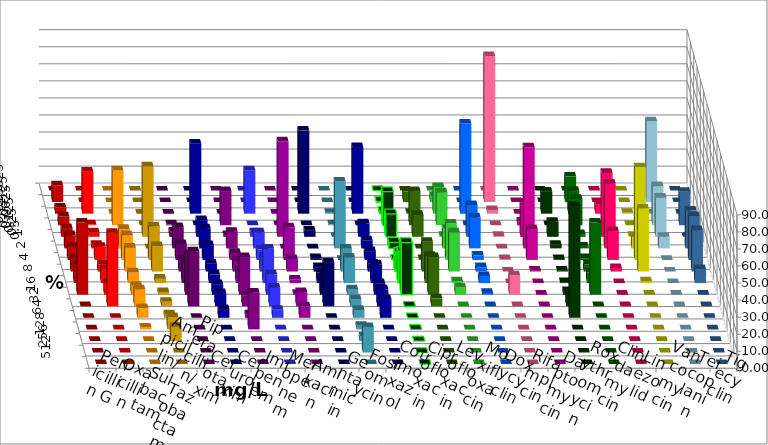
| Category | Penicillin G | Oxacillin | Ampicillin/ Sulbactam | Piperacillin/ Tazobactam | Cefotaxim | Cefuroxim | Imipenem | Meropenem | Amikacin | Gentamicin | Fosfomycin | Cotrimoxazol | Ciprofloxacin | Levofloxacin | Moxifloxacin | Doxycyclin | Rifampicin | Daptomycin | Roxythromycin | Clindamycin | Linezolid | Vancomycin | Teicoplanin | Tigecyclin |
|---|---|---|---|---|---|---|---|---|---|---|---|---|---|---|---|---|---|---|---|---|---|---|---|---|
| 0.015625 | 0 | 0 | 0 | 0 | 0 | 0 | 0 | 0 | 0 | 0 | 0 | 0 | 0 | 0 | 0 | 0 | 0 | 0 | 0 | 0 | 0 | 0 | 0 | 0 |
| 0.03125 | 9.794 | 0 | 0 | 0 | 0 | 0 | 0 | 0 | 0 | 0 | 0 | 0 | 0.518 | 6.154 | 3.646 | 0 | 85.641 | 0 | 0 | 14.948 | 0 | 0 | 0 | 47.396 |
| 0.0625 | 3.608 | 24.615 | 0 | 0 | 0 | 0 | 41.026 | 25.389 | 0 | 48.705 | 0.515 | 39.062 | 1.554 | 0.513 | 15.625 | 52.85 | 2.051 | 0 | 12.887 | 13.402 | 5.641 | 0.513 | 0 | 0 |
| 0.125 | 5.155 | 0.513 | 32.124 | 0 | 0.518 | 20 | 0 | 0 | 0 | 0 | 0.515 | 0 | 19.689 | 20 | 19.271 | 0 | 0 | 2.062 | 0 | 15.464 | 0 | 0 | 19.588 | 22.917 |
| 0.25 | 5.155 | 2.564 | 0 | 41.237 | 3.109 | 1.026 | 9.744 | 2.591 | 55.959 | 3.627 | 0 | 7.812 | 13.472 | 12.821 | 0.521 | 18.653 | 0.513 | 20.103 | 8.763 | 1.546 | 37.436 | 0.513 | 0 | 22.917 |
| 0.5 | 7.732 | 2.051 | 11.399 | 0 | 12.435 | 9.744 | 11.795 | 9.326 | 0 | 0 | 39.175 | 4.688 | 3.627 | 0 | 11.458 | 18.135 | 0 | 59.278 | 2.062 | 1.031 | 37.949 | 6.667 | 22.165 | 6.771 |
| 1.0 | 7.732 | 7.692 | 14.508 | 19.588 | 9.326 | 4.103 | 8.718 | 6.218 | 19.171 | 1.036 | 0 | 5.208 | 0.518 | 0.513 | 21.354 | 2.591 | 0.513 | 18.041 | 0.515 | 1.031 | 16.923 | 54.359 | 25.773 | 0 |
| 2.0 | 7.732 | 4.103 | 13.99 | 14.948 | 6.736 | 6.154 | 4.615 | 8.808 | 7.254 | 2.591 | 13.402 | 4.688 | 11.399 | 17.436 | 22.917 | 2.591 | 0 | 0.515 | 0.515 | 4.124 | 2.051 | 36.923 | 24.227 | 0 |
| 4.0 | 10.825 | 8.205 | 6.218 | 2.577 | 11.917 | 7.179 | 5.128 | 20.207 | 2.073 | 6.218 | 14.948 | 10.938 | 18.653 | 15.897 | 1.042 | 4.145 | 0 | 0 | 0.515 | 6.186 | 0 | 1.026 | 8.247 | 0 |
| 8.0 | 42.268 | 7.179 | 5.181 | 1.546 | 23.834 | 22.051 | 6.154 | 11.917 | 0.518 | 11.917 | 3.093 | 6.771 | 30.57 | 22.051 | 4.167 | 1.036 | 11.282 | 0 | 2.062 | 42.268 | 0 | 0 | 0 | 0 |
| 16.0 | 0 | 43.077 | 9.845 | 2.577 | 32.124 | 6.154 | 7.692 | 10.881 | 8.29 | 25.907 | 4.124 | 9.896 | 0 | 4.615 | 0 | 0 | 0 | 0 | 7.216 | 0 | 0 | 0 | 0 | 0 |
| 32.0 | 0 | 0 | 5.699 | 2.062 | 0 | 2.051 | 5.128 | 4.663 | 6.736 | 0 | 4.639 | 10.938 | 0 | 0 | 0 | 0 | 0 | 0 | 65.464 | 0 | 0 | 0 | 0 | 0 |
| 64.0 | 0 | 0 | 1.036 | 7.216 | 0 | 21.538 | 0 | 0 | 0 | 0 | 2.062 | 0 | 0 | 0 | 0 | 0 | 0 | 0 | 0 | 0 | 0 | 0 | 0 | 0 |
| 128.0 | 0 | 0 | 0 | 8.247 | 0 | 0 | 0 | 0 | 0 | 0 | 2.577 | 0 | 0 | 0 | 0 | 0 | 0 | 0 | 0 | 0 | 0 | 0 | 0 | 0 |
| 256.0 | 0 | 0 | 0 | 0 | 0 | 0 | 0 | 0 | 0 | 0 | 14.948 | 0 | 0 | 0 | 0 | 0 | 0 | 0 | 0 | 0 | 0 | 0 | 0 | 0 |
| 512.0 | 0 | 0 | 0 | 0 | 0 | 0 | 0 | 0 | 0 | 0 | 0 | 0 | 0 | 0 | 0 | 0 | 0 | 0 | 0 | 0 | 0 | 0 | 0 | 0 |